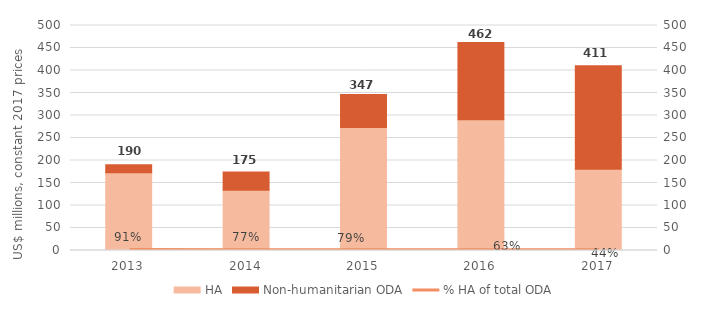
| Category | HA | Non-humanitarian ODA |
|---|---|---|
| 2013.0 | 172.853 | 17.448 |
| 2014.0 | 134.029 | 40.619 |
| 2015.0 | 273.082 | 73.702 |
| 2016.0 | 290.294 | 171.891 |
| 2017.0 | 180.693 | 229.941 |